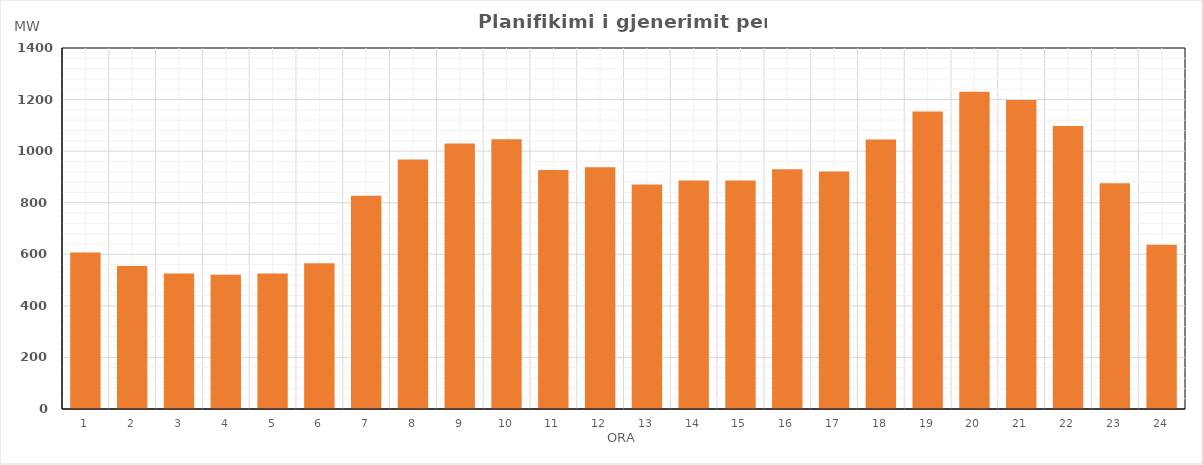
| Category | Max (MW) |
|---|---|
| 0 | 607.37 |
| 1 | 555.05 |
| 2 | 525.53 |
| 3 | 520.34 |
| 4 | 525.11 |
| 5 | 565.3 |
| 6 | 827.47 |
| 7 | 967.95 |
| 8 | 1029.24 |
| 9 | 1045.77 |
| 10 | 926.85 |
| 11 | 937.7 |
| 12 | 870.88 |
| 13 | 886.62 |
| 14 | 886.01 |
| 15 | 930.04 |
| 16 | 921.13 |
| 17 | 1044.9 |
| 18 | 1153.78 |
| 19 | 1230.18 |
| 20 | 1198.8 |
| 21 | 1097.7 |
| 22 | 875.7 |
| 23 | 637.23 |